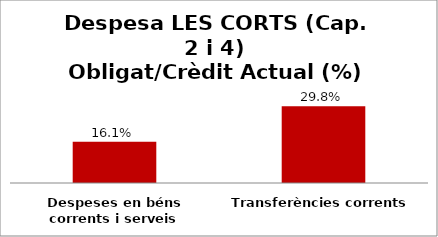
| Category | Series 0 |
|---|---|
| Despeses en béns corrents i serveis | 0.161 |
| Transferències corrents | 0.298 |